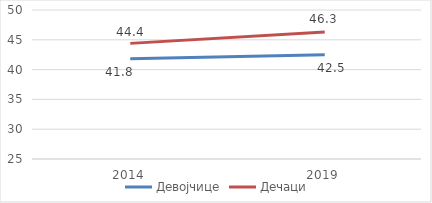
| Category | Девојчице | Дечаци |
|---|---|---|
| 2014.0 | 41.8 | 44.4 |
| 2019.0 | 42.5 | 46.3 |